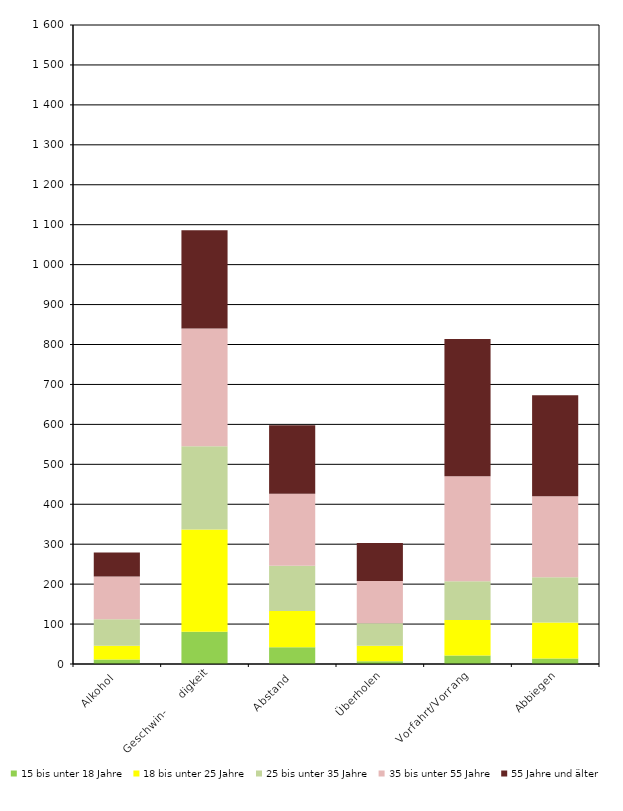
| Category |    15 bis unter 18 Jahre |    18 bis unter 25 Jahre |    25 bis unter 35 Jahre |    35 bis unter 55 Jahre |    55 Jahre und älter |
|---|---|---|---|---|---|
| 0 | 11 | 35 | 66 | 107 | 60 |
| 1 | 81 | 256 | 208 | 295 | 246 |
| 2 | 42 | 91 | 113 | 180 | 172 |
| 3 | 7 | 39 | 56 | 106 | 95 |
| 4 | 21 | 89 | 97 | 263 | 344 |
| 5 | 14 | 90 | 113 | 203 | 253 |